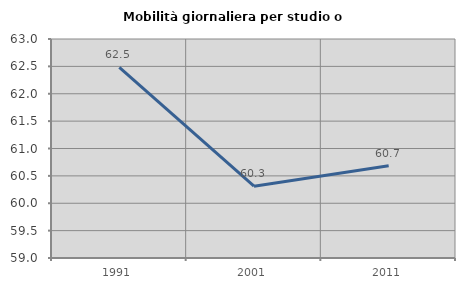
| Category | Mobilità giornaliera per studio o lavoro |
|---|---|
| 1991.0 | 62.484 |
| 2001.0 | 60.311 |
| 2011.0 | 60.686 |